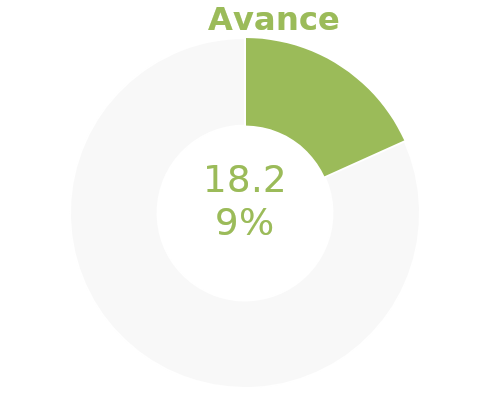
| Category | Series 0 |
|---|---|
| Acumulado 1 Trimestre | 0.183 |
| Año | -0.817 |